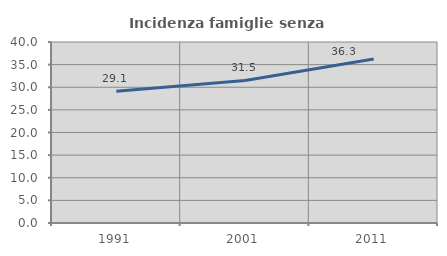
| Category | Incidenza famiglie senza nuclei |
|---|---|
| 1991.0 | 29.098 |
| 2001.0 | 31.513 |
| 2011.0 | 36.264 |